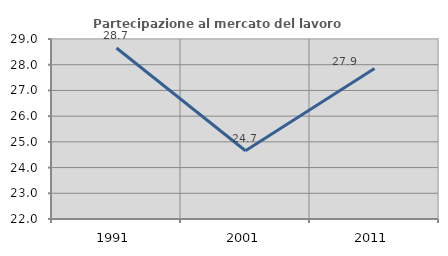
| Category | Partecipazione al mercato del lavoro  femminile |
|---|---|
| 1991.0 | 28.651 |
| 2001.0 | 24.655 |
| 2011.0 | 27.856 |